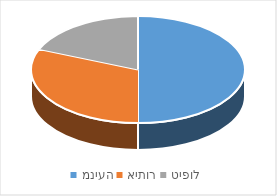
| Category | Series 0 |
|---|---|
| מניעה | 8 |
| איתור | 5 |
| טיפול | 3 |